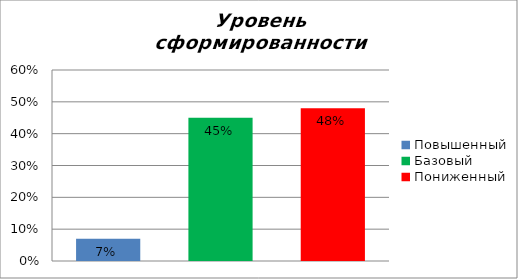
| Category | Уровень сформированности предметных результатов |
|---|---|
| Повышенный | 0.07 |
| Базовый | 0.45 |
| Пониженный | 0.48 |